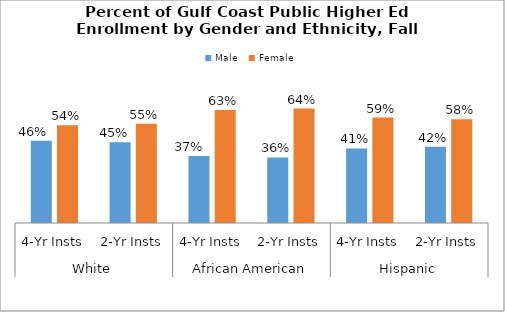
| Category | Male | Female |
|---|---|---|
| 0 | 0.458 | 0.542 |
| 1 | 0.449 | 0.551 |
| 2 | 0.372 | 0.628 |
| 3 | 0.364 | 0.636 |
| 4 | 0.415 | 0.585 |
| 5 | 0.424 | 0.576 |